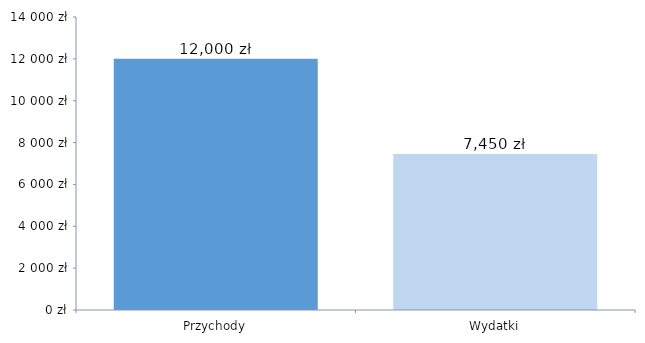
| Category | Series 0 |
|---|---|
| 0 | 12000 |
| 1 | 7450 |